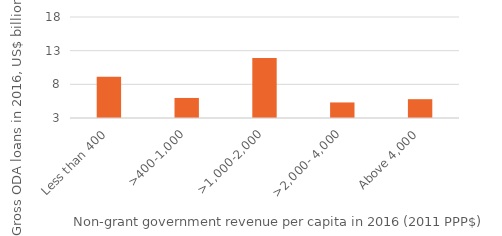
| Category | Series 0 |
|---|---|
| Less than 400 | 9119.347 |
| >400-1,000 | 5977.235 |
| >1,000-2,000 | 11905.97 |
| >2,000- 4,000 | 5308.694 |
| Above 4,000 | 5794.641 |